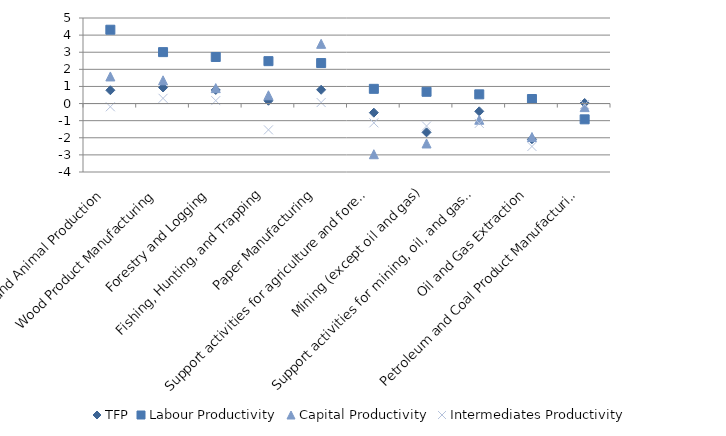
| Category | TFP | Labour Productivity | Capital Productivity | Intermediates Productivity |
|---|---|---|---|---|
| Crop and Animal Production | 0.777 | 4.315 | 1.584 | -0.188 |
| Wood Product Manufacturing | 0.938 | 3.006 | 1.358 | 0.305 |
| Forestry and Logging | 0.794 | 2.722 | 0.902 | 0.172 |
| Fishing, Hunting, and Trapping | 0.163 | 2.478 | 0.484 | -1.538 |
| Paper Manufacturing | 0.806 | 2.367 | 3.491 | 0.059 |
| Support activities for agriculture and forestry | -0.533 | 0.86 | -2.961 | -1.127 |
| Mining (except oil and gas) | -1.683 | 0.688 | -2.333 | -1.312 |
| Support activities for mining, oil, and gas extraction | -0.454 | 0.538 | -0.947 | -1.158 |
| Oil and Gas Extraction | -2.085 | 0.266 | -1.955 | -2.506 |
| Petroleum and Coal Product Manufacturing | 0.033 | -0.922 | -0.208 | -0.056 |